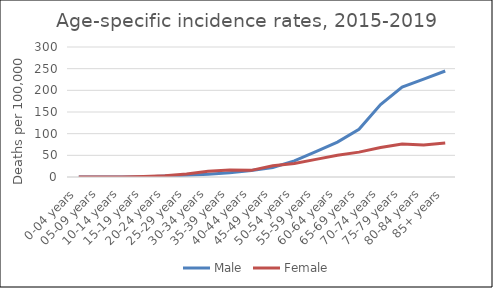
| Category | Male | Female |
|---|---|---|
| 0-04 years | 0 | 0 |
| 05-09 years | 0 | 0 |
| 10-14 years | 0 | 0 |
| 15-19 years | 0 | 1.43 |
| 20-24 years | 2.24 | 2.89 |
| 25-29 years | 4.08 | 7.08 |
| 30-34 years | 6.08 | 13.17 |
| 35-39 years | 10.01 | 16.34 |
| 40-44 years | 14.76 | 15.31 |
| 45-49 years | 22.1 | 26.12 |
| 50-54 years | 37.27 | 31.03 |
| 55-59 years | 58.61 | 40.69 |
| 60-64 years | 80.54 | 50.3 |
| 65-69 years | 109.96 | 57.36 |
| 70-74 years | 167.09 | 67.92 |
| 75-79 years | 207.26 | 76.34 |
| 80-84 years | 226.01 | 74.1 |
| 85+ years | 244.67 | 78.58 |